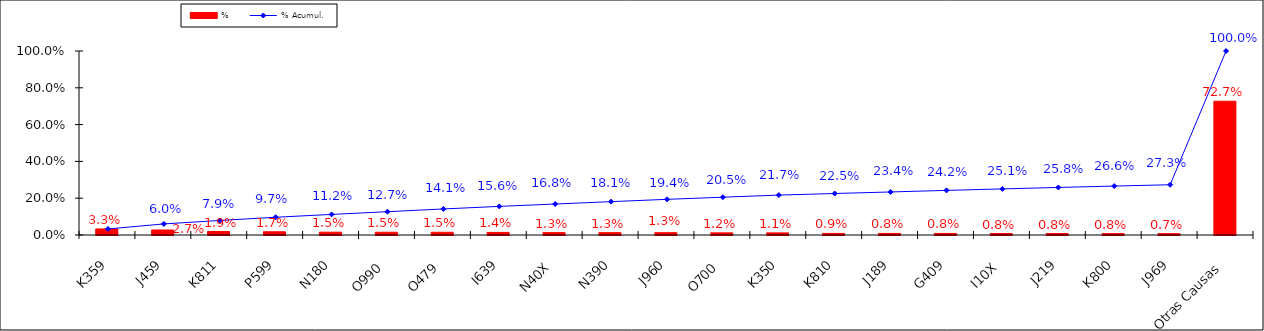
| Category | % |
|---|---|
| K359 | 0.033 |
| J459 | 0.027 |
| K811 | 0.019 |
| P599 | 0.017 |
| N180 | 0.015 |
| O990 | 0.015 |
| O479 | 0.015 |
| I639 | 0.014 |
| N40X | 0.013 |
| N390 | 0.013 |
| J960 | 0.013 |
| O700 | 0.012 |
| K350 | 0.011 |
| K810 | 0.009 |
| J189 | 0.008 |
| G409 | 0.008 |
| I10X | 0.008 |
| J219 | 0.008 |
| K800 | 0.008 |
| J969 | 0.007 |
| Otras Causas | 0.727 |